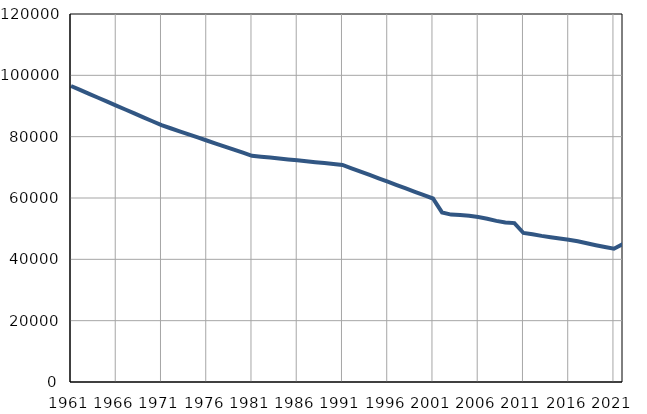
| Category | Број
становника |
|---|---|
| 1961.0 | 96517 |
| 1962.0 | 95239 |
| 1963.0 | 93962 |
| 1964.0 | 92685 |
| 1965.0 | 91407 |
| 1966.0 | 90130 |
| 1967.0 | 88852 |
| 1968.0 | 87575 |
| 1969.0 | 86297 |
| 1970.0 | 85020 |
| 1971.0 | 83742 |
| 1972.0 | 82745 |
| 1973.0 | 81747 |
| 1974.0 | 80750 |
| 1975.0 | 79752 |
| 1976.0 | 78755 |
| 1977.0 | 77757 |
| 1978.0 | 76760 |
| 1979.0 | 75762 |
| 1980.0 | 74765 |
| 1981.0 | 73767 |
| 1982.0 | 73469 |
| 1983.0 | 73172 |
| 1984.0 | 72874 |
| 1985.0 | 72577 |
| 1986.0 | 72279 |
| 1987.0 | 71981 |
| 1988.0 | 71684 |
| 1989.0 | 71386 |
| 1990.0 | 71089 |
| 1991.0 | 70791 |
| 1992.0 | 69695 |
| 1993.0 | 68599 |
| 1994.0 | 67503 |
| 1995.0 | 66407 |
| 1996.0 | 65311 |
| 1997.0 | 64215 |
| 1998.0 | 63119 |
| 1999.0 | 62023 |
| 2000.0 | 60927 |
| 2001.0 | 59831 |
| 2002.0 | 55290 |
| 2003.0 | 54588 |
| 2004.0 | 54449 |
| 2005.0 | 54242 |
| 2006.0 | 53790 |
| 2007.0 | 53256 |
| 2008.0 | 52546 |
| 2009.0 | 52029 |
| 2010.0 | 51816 |
| 2011.0 | 48593 |
| 2012.0 | 48170 |
| 2013.0 | 47646 |
| 2014.0 | 47190 |
| 2015.0 | 46785 |
| 2016.0 | 46382 |
| 2017.0 | 45877 |
| 2018.0 | 45253 |
| 2019.0 | 44613 |
| 2020.0 | 44031 |
| 2021.0 | 43449 |
| 2022.0 | 44978 |